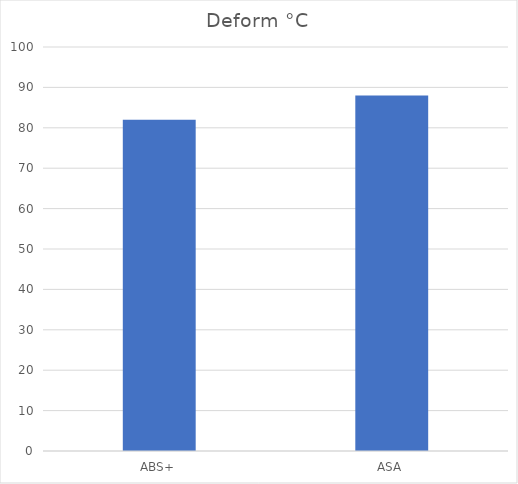
| Category | Deform °C |
|---|---|
| ABS+ | 82 |
| ASA | 88 |